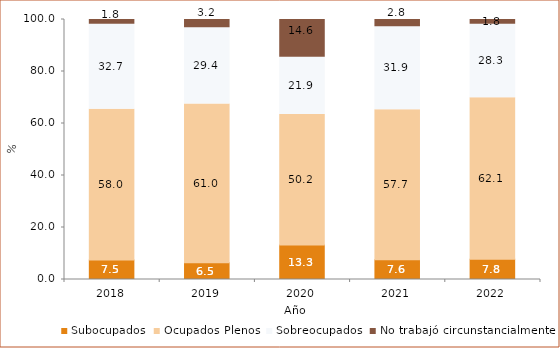
| Category | Subocupados | Ocupados Plenos | Sobreocupados | No trabajó circunstancialmente |
|---|---|---|---|---|
| 2018.0 | 7.508 | 57.959 | 32.709 | 1.824 |
| 2019.0 | 6.486 | 61 | 29.36 | 3.154 |
| 2020.0 | 13.291 | 50.2 | 21.945 | 14.627 |
| 2021.0 | 7.6 | 57.713 | 31.934 | 2.768 |
| 2022.0 | 7.8 | 62.1 | 28.3 | 1.8 |